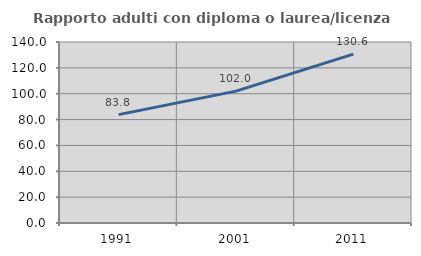
| Category | Rapporto adulti con diploma o laurea/licenza media  |
|---|---|
| 1991.0 | 83.836 |
| 2001.0 | 101.987 |
| 2011.0 | 130.645 |